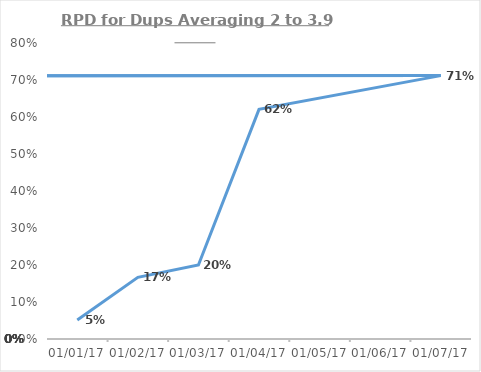
| Category | RPD |
|---|---|
| 2017-01-01 | 0.051 |
| 2017-01-02 | 0.167 |
| 2017-01-03 | 0.2 |
| 2017-01-04 | 0.621 |
| 2017-01-07 | 0.712 |
| nan | 0 |
| nan | 0 |
| nan | 0 |
| nan | 0 |
| nan | 0 |